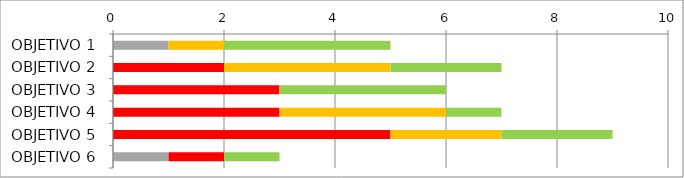
| Category | Series 0 | Series 1 | Series 2 | Series 3 | Series 4 | Series 5 |
|---|---|---|---|---|---|---|
| OBJETIVO 1 | 0 | 1 | 0 | 1 | 3 | 0 |
| OBJETIVO 2 | 0 | 0 | 2 | 3 | 2 | 0 |
| OBJETIVO 3 | 0 | 0 | 3 | 0 | 3 | 0 |
| OBJETIVO 4 | 0 | 0 | 3 | 3 | 1 | 0 |
| OBJETIVO 5 | 0 | 0 | 5 | 2 | 2 | 0 |
| OBJETIVO 6 | 0 | 1 | 1 | 0 | 1 | 0 |